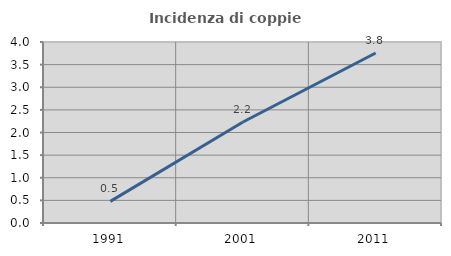
| Category | Incidenza di coppie miste |
|---|---|
| 1991.0 | 0.477 |
| 2001.0 | 2.232 |
| 2011.0 | 3.757 |